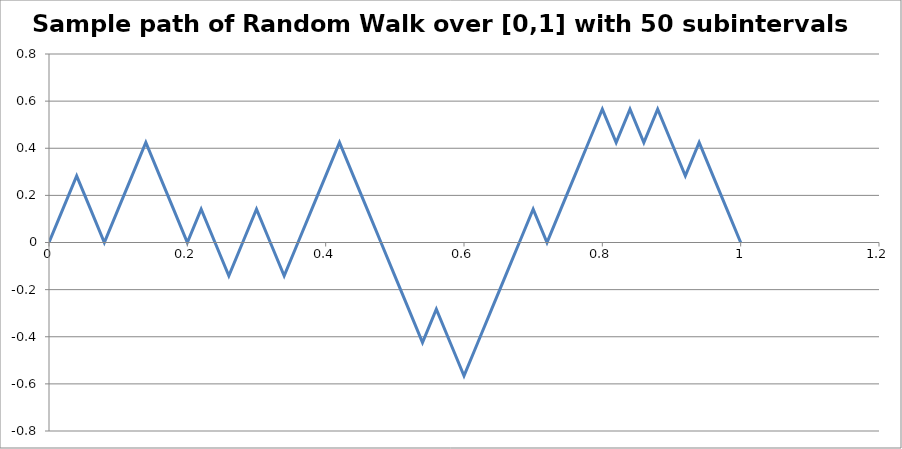
| Category | W_i |
|---|---|
| 0.0 | 0 |
| 0.02 | 0.141 |
| 0.04 | 0.283 |
| 0.06 | 0.141 |
| 0.08 | 0 |
| 0.1 | 0.141 |
| 0.12000000000000001 | 0.283 |
| 0.14 | 0.424 |
| 0.16 | 0.283 |
| 0.18 | 0.141 |
| 0.19999999999999998 | 0 |
| 0.21999999999999997 | 0.141 |
| 0.23999999999999996 | 0 |
| 0.25999999999999995 | -0.141 |
| 0.27999999999999997 | 0 |
| 0.3 | 0.141 |
| 0.32 | 0 |
| 0.34 | -0.141 |
| 0.36000000000000004 | 0 |
| 0.38000000000000006 | 0.141 |
| 0.4000000000000001 | 0.283 |
| 0.4200000000000001 | 0.424 |
| 0.4400000000000001 | 0.283 |
| 0.46000000000000013 | 0.141 |
| 0.48000000000000015 | 0 |
| 0.5000000000000001 | -0.141 |
| 0.5200000000000001 | -0.283 |
| 0.5400000000000001 | -0.424 |
| 0.5600000000000002 | -0.283 |
| 0.5800000000000002 | -0.424 |
| 0.6000000000000002 | -0.566 |
| 0.6200000000000002 | -0.424 |
| 0.6400000000000002 | -0.283 |
| 0.6600000000000003 | -0.141 |
| 0.6800000000000003 | 0 |
| 0.7000000000000003 | 0.141 |
| 0.7200000000000003 | 0 |
| 0.7400000000000003 | 0.141 |
| 0.7600000000000003 | 0.283 |
| 0.7800000000000004 | 0.424 |
| 0.8000000000000004 | 0.566 |
| 0.8200000000000004 | 0.424 |
| 0.8400000000000004 | 0.566 |
| 0.8600000000000004 | 0.424 |
| 0.8800000000000004 | 0.566 |
| 0.9000000000000005 | 0.424 |
| 0.9200000000000005 | 0.283 |
| 0.9400000000000005 | 0.424 |
| 0.9600000000000005 | 0.283 |
| 0.9800000000000005 | 0.141 |
| 1.0000000000000004 | 0 |